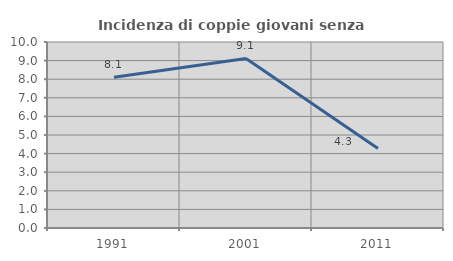
| Category | Incidenza di coppie giovani senza figli |
|---|---|
| 1991.0 | 8.106 |
| 2001.0 | 9.114 |
| 2011.0 | 4.273 |